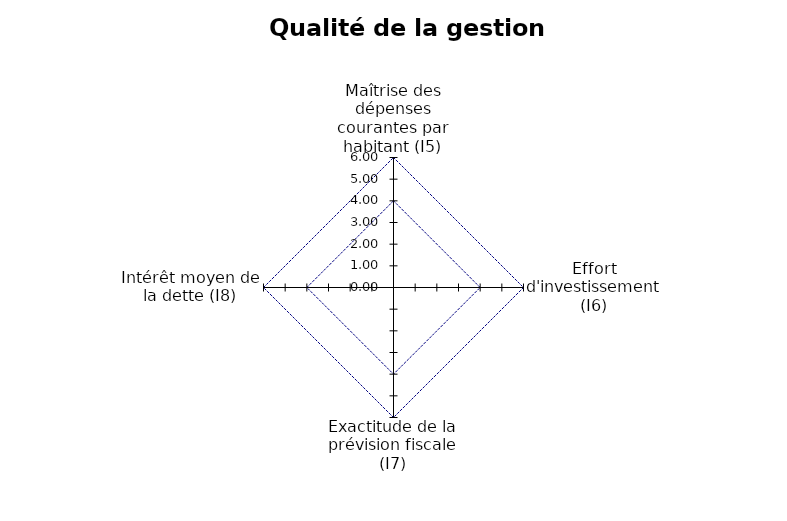
| Category | Valeurs des incateurs | Valeurs moyennes des indicateurs | max |
|---|---|---|---|
| Maîtrise des dépenses courantes par habitant (I5) | 0 | 4 | 6 |
| Effort d'investissement (I6) | 0 | 4 | 6 |
| Exactitude de la prévision fiscale (I7) | 0 | 4 | 6 |
| Intérêt moyen de la dette (I8) | 0 | 4 | 6 |